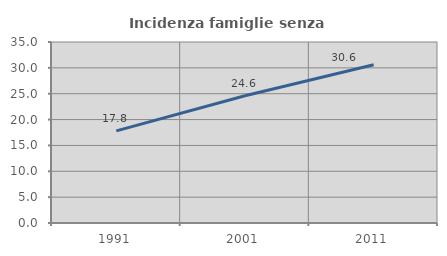
| Category | Incidenza famiglie senza nuclei |
|---|---|
| 1991.0 | 17.814 |
| 2001.0 | 24.613 |
| 2011.0 | 30.6 |